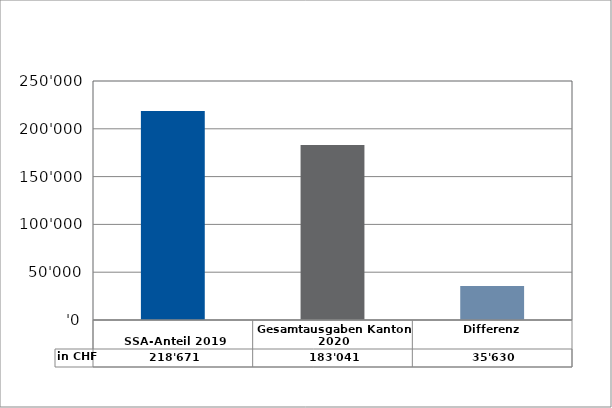
| Category | in CHF |
|---|---|
| 
SSA-Anteil 2019

 | 218670.75 |
| Gesamtausgaben Kanton 2020
 | 183041 |
| Differenz | 35629.75 |